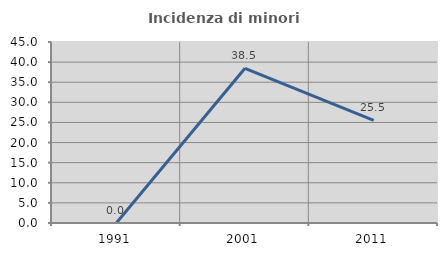
| Category | Incidenza di minori stranieri |
|---|---|
| 1991.0 | 0 |
| 2001.0 | 38.462 |
| 2011.0 | 25.503 |